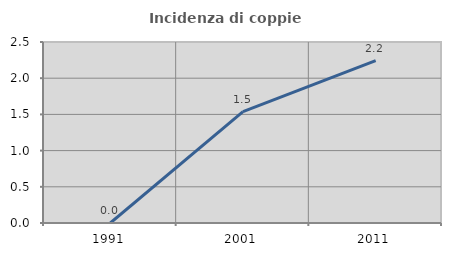
| Category | Incidenza di coppie miste |
|---|---|
| 1991.0 | 0 |
| 2001.0 | 1.538 |
| 2011.0 | 2.242 |